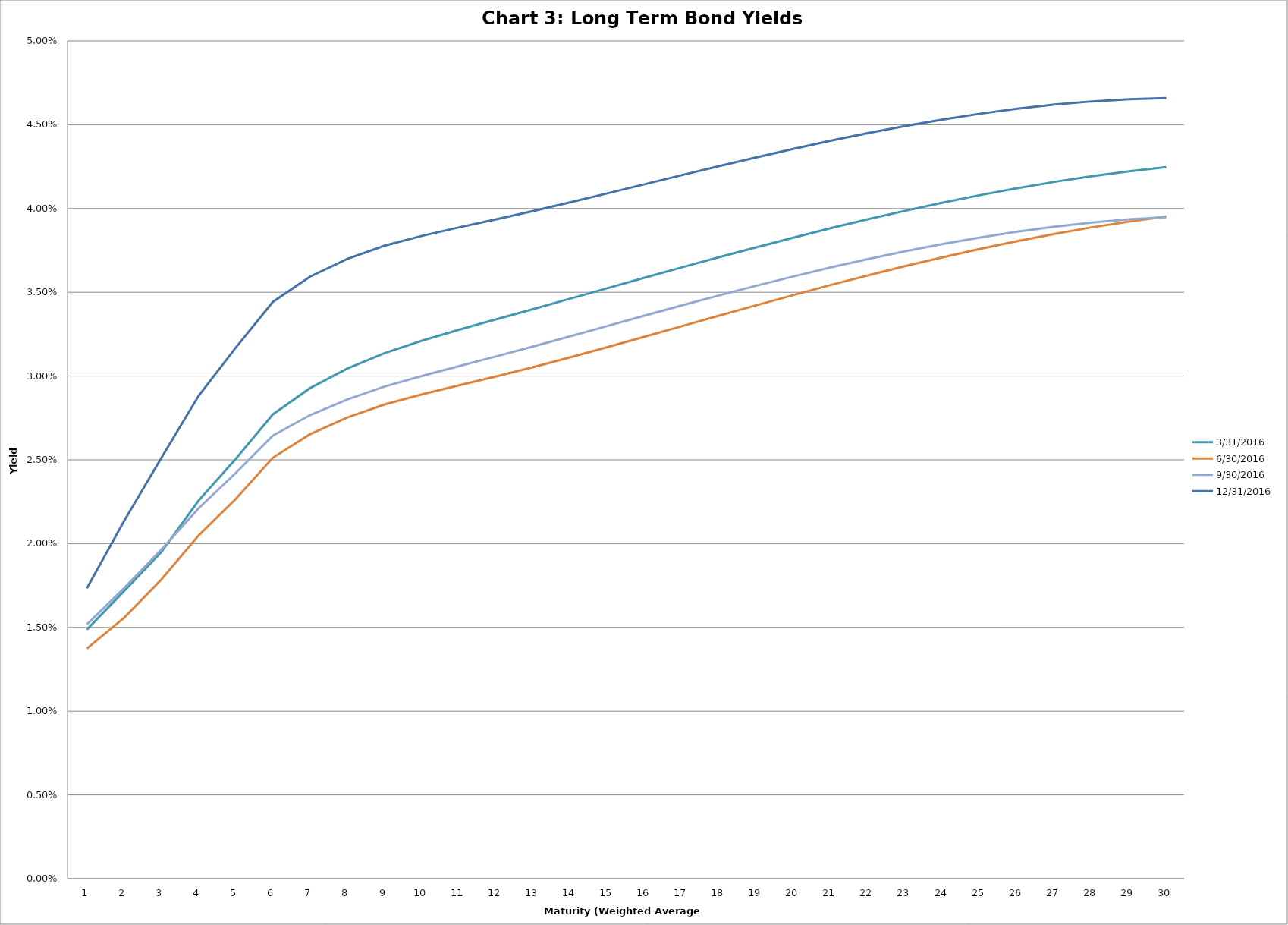
| Category | 3/31/2016 | 6/30/2016 | 9/30/2016 | 12/31/2016 |
|---|---|---|---|---|
| 0 | 0.015 | 0.014 | 0.015 | 0.017 |
| 1 | 0.017 | 0.016 | 0.017 | 0.021 |
| 2 | 0.019 | 0.018 | 0.02 | 0.025 |
| 3 | 0.023 | 0.02 | 0.022 | 0.029 |
| 4 | 0.025 | 0.023 | 0.024 | 0.032 |
| 5 | 0.028 | 0.025 | 0.026 | 0.034 |
| 6 | 0.029 | 0.027 | 0.028 | 0.036 |
| 7 | 0.03 | 0.028 | 0.029 | 0.037 |
| 8 | 0.031 | 0.028 | 0.029 | 0.038 |
| 9 | 0.032 | 0.029 | 0.03 | 0.038 |
| 10 | 0.033 | 0.029 | 0.031 | 0.039 |
| 11 | 0.033 | 0.03 | 0.031 | 0.039 |
| 12 | 0.034 | 0.031 | 0.032 | 0.04 |
| 13 | 0.035 | 0.031 | 0.032 | 0.04 |
| 14 | 0.035 | 0.032 | 0.033 | 0.041 |
| 15 | 0.036 | 0.032 | 0.034 | 0.041 |
| 16 | 0.036 | 0.033 | 0.034 | 0.042 |
| 17 | 0.037 | 0.034 | 0.035 | 0.043 |
| 18 | 0.038 | 0.034 | 0.035 | 0.043 |
| 19 | 0.038 | 0.035 | 0.036 | 0.044 |
| 20 | 0.039 | 0.035 | 0.036 | 0.044 |
| 21 | 0.039 | 0.036 | 0.037 | 0.045 |
| 22 | 0.04 | 0.037 | 0.037 | 0.045 |
| 23 | 0.04 | 0.037 | 0.038 | 0.045 |
| 24 | 0.041 | 0.038 | 0.038 | 0.046 |
| 25 | 0.041 | 0.038 | 0.039 | 0.046 |
| 26 | 0.042 | 0.038 | 0.039 | 0.046 |
| 27 | 0.042 | 0.039 | 0.039 | 0.046 |
| 28 | 0.042 | 0.039 | 0.039 | 0.047 |
| 29 | 0.042 | 0.04 | 0.039 | 0.047 |